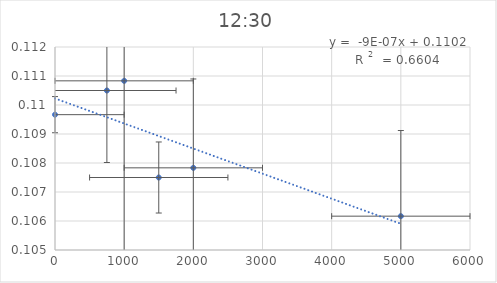
| Category | Series 0 |
|---|---|
| 5000.0 | 0.106 |
| 2000.0 | 0.108 |
| 1500.0 | 0.108 |
| 1000.0 | 0.111 |
| 750.0 | 0.11 |
| 0.0 | 0.11 |